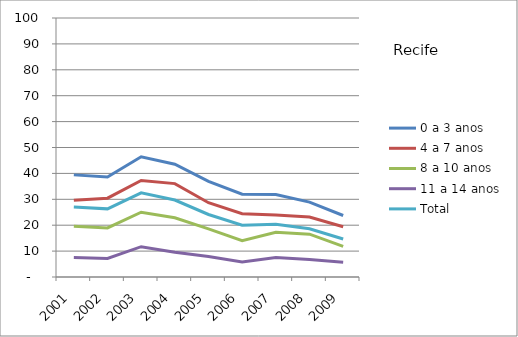
| Category | 0 a 3 anos | 4 a 7 anos | 8 a 10 anos | 11 a 14 anos | Total |
|---|---|---|---|---|---|
| 2001.0 | 39.43 | 29.6 | 19.6 | 7.52 | 27 |
| 2002.0 | 38.6 | 30.44 | 18.93 | 7.17 | 26.31 |
| 2003.0 | 46.4 | 37.26 | 25.02 | 11.71 | 32.49 |
| 2004.0 | 43.56 | 36.06 | 22.85 | 9.53 | 29.71 |
| 2005.0 | 36.95 | 28.68 | 18.58 | 7.88 | 24.14 |
| 2006.0 | 31.98 | 24.45 | 14.06 | 5.84 | 20 |
| 2007.0 | 31.86 | 23.95 | 17.24 | 7.56 | 20.35 |
| 2008.0 | 28.93 | 23.16 | 16.54 | 6.76 | 18.64 |
| 2009.0 | 23.74 | 19.4 | 11.8 | 5.72 | 14.68 |